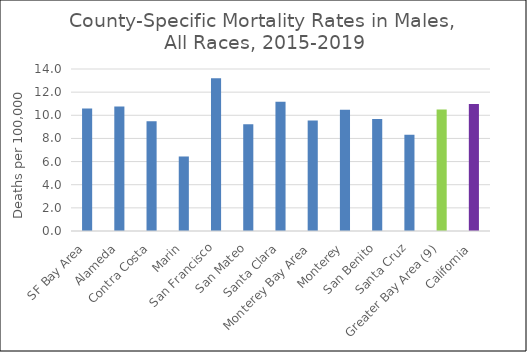
| Category | Male |
|---|---|
| SF Bay Area | 10.59 |
|   Alameda | 10.77 |
|   Contra Costa | 9.48 |
|   Marin | 6.44 |
|   San Francisco | 13.19 |
|   San Mateo | 9.23 |
|   Santa Clara | 11.18 |
| Monterey Bay Area | 9.54 |
|   Monterey | 10.47 |
|   San Benito | 9.68 |
|   Santa Cruz | 8.32 |
| Greater Bay Area (9) | 10.49 |
| California | 10.98 |